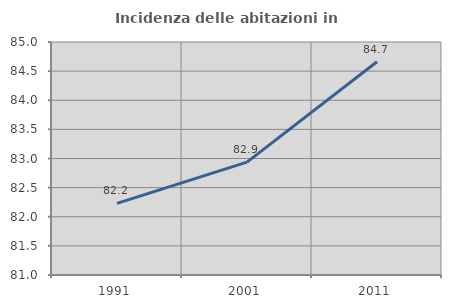
| Category | Incidenza delle abitazioni in proprietà  |
|---|---|
| 1991.0 | 82.231 |
| 2001.0 | 82.937 |
| 2011.0 | 84.662 |